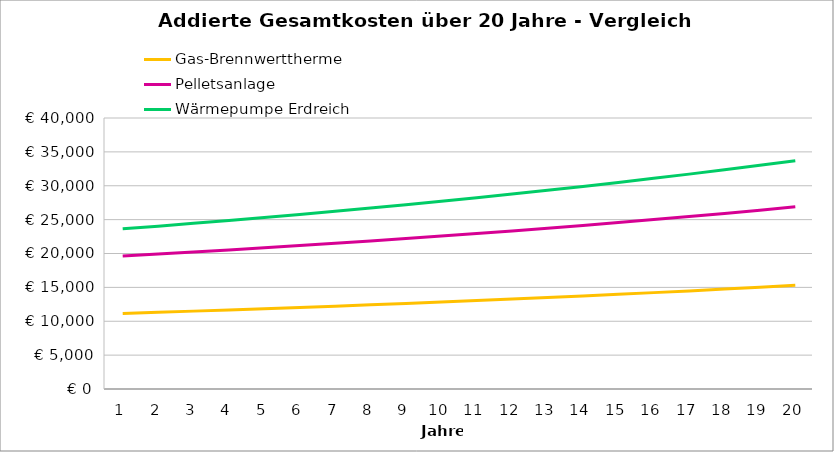
| Category | Gas-Brennwerttherme | Pelletsanlage | Wärmepumpe Erdreich |
|---|---|---|---|
| 0 | 11160 | 19640 | 23639 |
| 1 | 11324.8 | 19928.4 | 24039.67 |
| 2 | 11494.544 | 20225.452 | 24452.36 |
| 3 | 11669.38 | 20531.416 | 24877.431 |
| 4 | 11849.462 | 20846.558 | 25315.254 |
| 5 | 12034.946 | 21171.155 | 25766.211 |
| 6 | 12225.994 | 21505.489 | 26230.698 |
| 7 | 12422.774 | 21849.854 | 26709.119 |
| 8 | 12625.457 | 22204.55 | 27201.892 |
| 9 | 12834.221 | 22569.886 | 27709.449 |
| 10 | 13049.247 | 22946.183 | 28232.233 |
| 11 | 13270.725 | 23333.768 | 28770.699 |
| 12 | 13498.846 | 23732.981 | 29325.32 |
| 13 | 13733.812 | 24144.171 | 29896.58 |
| 14 | 13975.826 | 24567.696 | 30484.978 |
| 15 | 14225.101 | 25003.927 | 31091.027 |
| 16 | 14481.854 | 25453.245 | 31715.258 |
| 17 | 14746.31 | 25916.042 | 32358.215 |
| 18 | 15018.699 | 26392.723 | 33020.462 |
| 19 | 15299.26 | 26883.705 | 33702.576 |